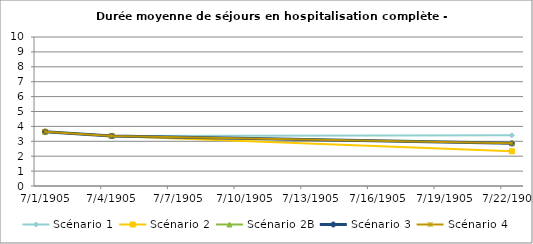
| Category | Scénario 1 | Scénario 2 | Scénario 2B | Scénario 3 | Scénario 4 |
|---|---|---|---|---|---|
| 2009.0 | 3.647 | 3.647 | 3.647 | 3.647 | 3.647 |
| 2012.0 | 3.361 | 3.361 | 3.361 | 3.361 | 3.361 |
| 2030.0 | 3.405 | 2.329 | 2.863 | 2.863 | 2.863 |